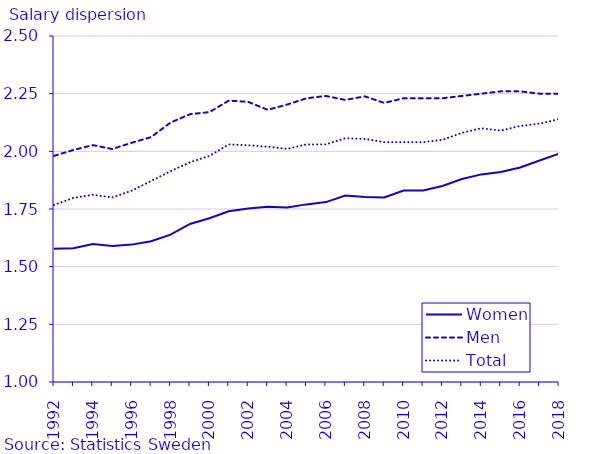
| Category | Women | Men | Total |
|---|---|---|---|
| 1992.0 | 1.578 | 1.98 | 1.768 |
| 1993.0 | 1.58 | 2.006 | 1.798 |
| 1994.0 | 1.598 | 2.027 | 1.812 |
| 1995.0 | 1.59 | 2.01 | 1.8 |
| 1996.0 | 1.596 | 2.037 | 1.83 |
| 1997.0 | 1.61 | 2.062 | 1.871 |
| 1998.0 | 1.639 | 2.125 | 1.914 |
| 1999.0 | 1.685 | 2.161 | 1.953 |
| 2000.0 | 1.71 | 2.17 | 1.98 |
| 2001.0 | 1.74 | 2.22 | 2.03 |
| 2002.0 | 1.752 | 2.214 | 2.026 |
| 2003.0 | 1.76 | 2.18 | 2.02 |
| 2004.0 | 1.756 | 2.203 | 2.011 |
| 2005.0 | 1.77 | 2.23 | 2.03 |
| 2006.0 | 1.78 | 2.24 | 2.03 |
| 2007.0 | 1.808 | 2.223 | 2.057 |
| 2008.0 | 1.802 | 2.238 | 2.054 |
| 2009.0 | 1.8 | 2.21 | 2.04 |
| 2010.0 | 1.83 | 2.23 | 2.04 |
| 2011.0 | 1.83 | 2.23 | 2.04 |
| 2012.0 | 1.85 | 2.23 | 2.05 |
| 2013.0 | 1.88 | 2.24 | 2.08 |
| 2014.0 | 1.9 | 2.25 | 2.1 |
| 2015.0 | 1.91 | 2.26 | 2.09 |
| 2016.0 | 1.93 | 2.26 | 2.11 |
| 2017.0 | 1.96 | 2.25 | 2.12 |
| 2018.0 | 1.99 | 2.25 | 2.14 |